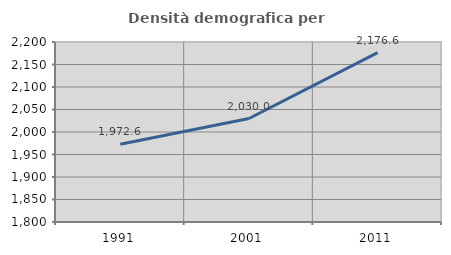
| Category | Densità demografica |
|---|---|
| 1991.0 | 1972.615 |
| 2001.0 | 2029.988 |
| 2011.0 | 2176.554 |